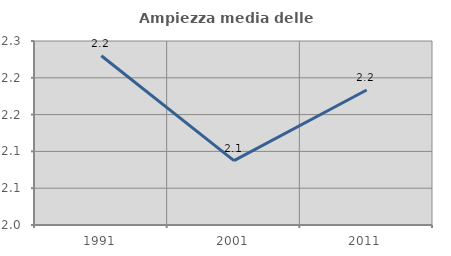
| Category | Ampiezza media delle famiglie |
|---|---|
| 1991.0 | 2.23 |
| 2001.0 | 2.088 |
| 2011.0 | 2.183 |